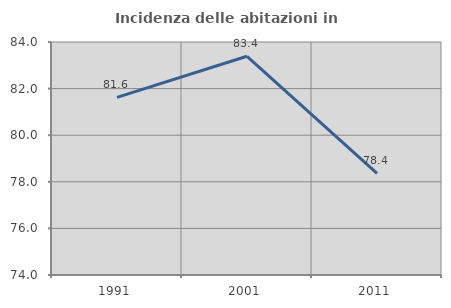
| Category | Incidenza delle abitazioni in proprietà  |
|---|---|
| 1991.0 | 81.625 |
| 2001.0 | 83.387 |
| 2011.0 | 78.361 |